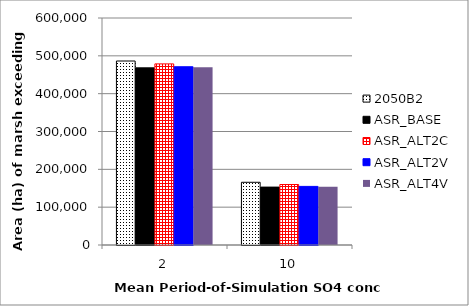
| Category | 2050B2 | ASR_BASE | ASR_ALT2C | ASR_ALT2V | ASR_ALT4V |
|---|---|---|---|---|---|
| 2.0 | 486325 | 468250 | 478725 | 471175 | 469775 |
| 10.0 | 165775 | 153050 | 159900 | 154875 | 153700 |